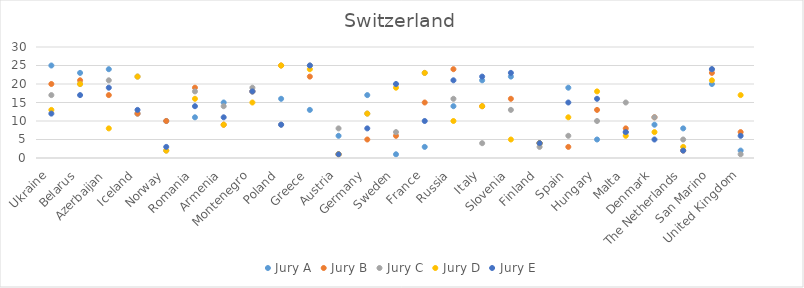
| Category | Jury A | Jury B | Jury C | Jury D | Jury E |
|---|---|---|---|---|---|
| Ukraine | 25 | 20 | 17 | 13 | 12 |
| Belarus | 23 | 21 | 20 | 20 | 17 |
| Azerbaijan | 24 | 17 | 21 | 8 | 19 |
| Iceland | 12 | 12 | 22 | 22 | 13 |
| Norway | 10 | 10 | 2 | 2 | 3 |
| Romania | 11 | 19 | 18 | 16 | 14 |
| Armenia | 15 | 9 | 14 | 9 | 11 |
| Montenegro | 18 | 18 | 19 | 15 | 18 |
| Poland | 16 | 25 | 9 | 25 | 9 |
| Greece | 13 | 22 | 25 | 24 | 25 |
| Austria | 6 | 1 | 8 | 1 | 1 |
| Germany | 17 | 5 | 12 | 12 | 8 |
| Sweden | 1 | 6 | 7 | 19 | 20 |
| France | 3 | 15 | 23 | 23 | 10 |
| Russia | 14 | 24 | 16 | 10 | 21 |
| Italy | 21 | 14 | 4 | 14 | 22 |
| Slovenia | 22 | 16 | 13 | 5 | 23 |
| Finland | 4 | 4 | 3 | 4 | 4 |
| Spain | 19 | 3 | 6 | 11 | 15 |
| Hungary | 5 | 13 | 10 | 18 | 16 |
| Malta | 7 | 8 | 15 | 6 | 7 |
| Denmark | 9 | 11 | 11 | 7 | 5 |
| The Netherlands | 8 | 2 | 5 | 3 | 2 |
| San Marino | 20 | 23 | 24 | 21 | 24 |
| United Kingdom | 2 | 7 | 1 | 17 | 6 |